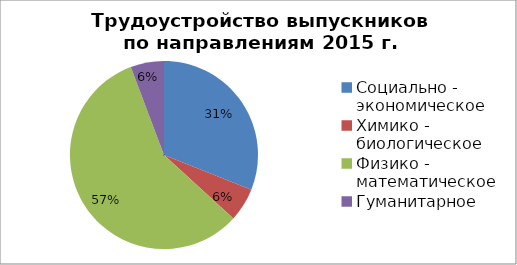
| Category | Series 0 |
|---|---|
| Социально - экономическое | 27 |
| Химико - биологическое | 5 |
| Физико - математическое | 50 |
| Гуманитарное | 5 |